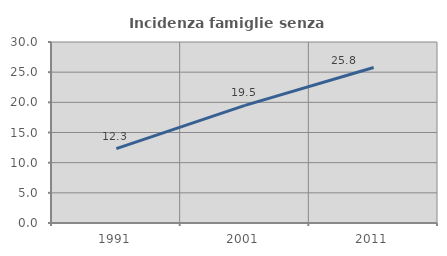
| Category | Incidenza famiglie senza nuclei |
|---|---|
| 1991.0 | 12.34 |
| 2001.0 | 19.486 |
| 2011.0 | 25.773 |